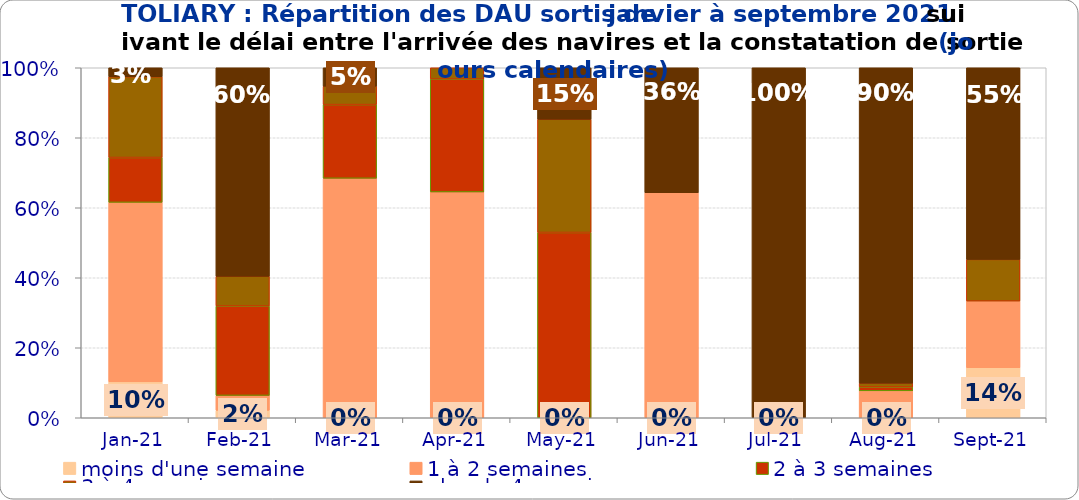
| Category | moins d'une semaine | 1 à 2 semaines | 2 à 3 semaines | 3 à 4 semaines | plus de 4 semaines |
|---|---|---|---|---|---|
| 2021-01-01 | 0.103 | 0.513 | 0.128 | 0.231 | 0.026 |
| 2021-02-01 | 0.021 | 0.043 | 0.255 | 0.085 | 0.596 |
| 2021-03-01 | 0 | 0.684 | 0.211 | 0.053 | 0.053 |
| 2021-04-01 | 0 | 0.645 | 0.323 | 0.032 | 0 |
| 2021-05-01 | 0 | 0 | 0.529 | 0.324 | 0.147 |
| 2021-06-01 | 0 | 0.643 | 0 | 0 | 0.357 |
| 2021-07-01 | 0 | 0 | 0 | 0 | 1 |
| 2021-08-01 | 0 | 0.077 | 0.011 | 0.011 | 0.901 |
| 2021-09-01 | 0.143 | 0.19 | 0 | 0.119 | 0.548 |